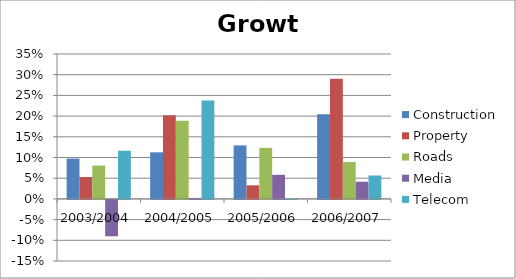
| Category | Construction | Property | Roads | Media | Telecom |
|---|---|---|---|---|---|
| 2003/2004 | 0.097 | 0.053 | 0.081 | -0.088 | 0.116 |
| 2004/2005 | 0.113 | 0.202 | 0.189 | 0.002 | 0.238 |
| 2005/2006 | 0.129 | 0.033 | 0.123 | 0.058 | 0 |
| 2006/2007 | 0.205 | 0.29 | 0.089 | 0.041 | 0.057 |